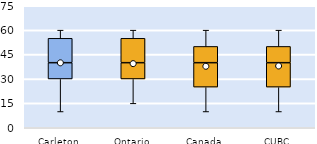
| Category | 25th | 50th | 75th |
|---|---|---|---|
| Carleton | 30 | 10 | 15 |
| Ontario | 30 | 10 | 15 |
| Canada | 25 | 15 | 10 |
| CUBC | 25 | 15 | 10 |